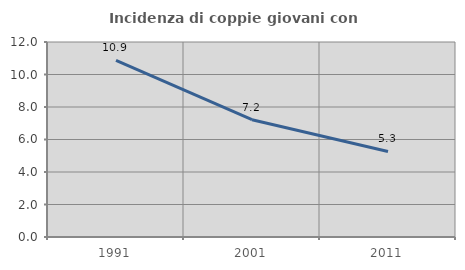
| Category | Incidenza di coppie giovani con figli |
|---|---|
| 1991.0 | 10.874 |
| 2001.0 | 7.22 |
| 2011.0 | 5.263 |